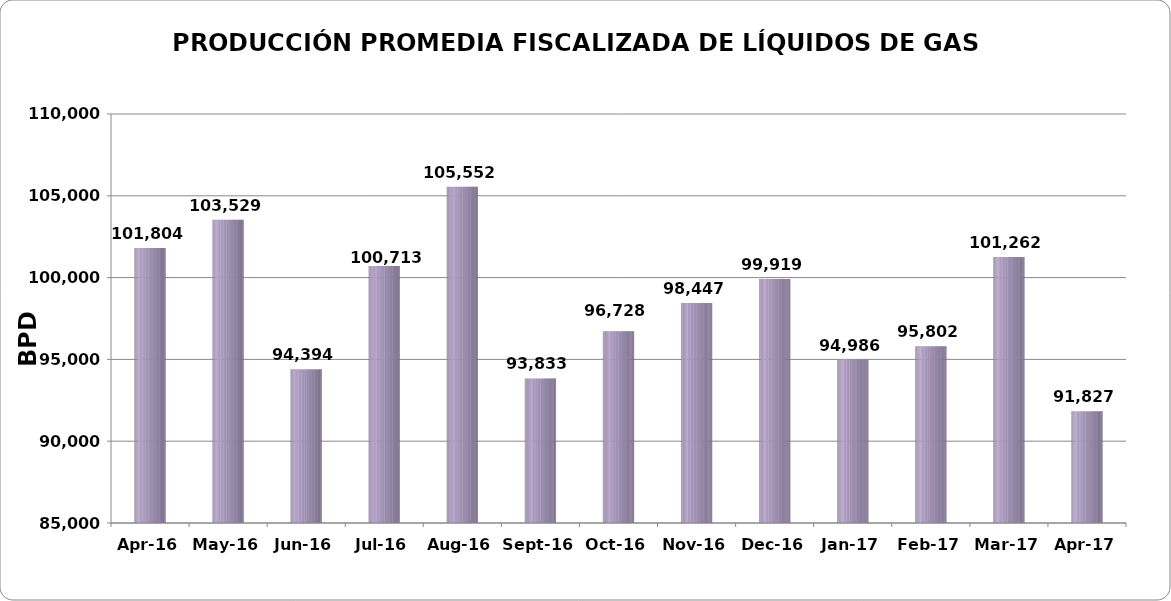
| Category | Series 0 |
|---|---|
| 2016-04-01 | 101803.833 |
| 2016-05-01 | 103529.194 |
| 2016-06-01 | 94393.767 |
| 2016-07-01 | 100713.355 |
| 2016-08-01 | 105552.1 |
| 2016-09-01 | 93833.1 |
| 2016-10-01 | 96727.548 |
| 2016-11-01 | 98446.71 |
| 2016-12-01 | 99919.129 |
| 2017-01-01 | 94986 |
| 2017-02-01 | 95802.107 |
| 2017-03-01 | 101262.286 |
| 2017-04-01 | 91827.464 |